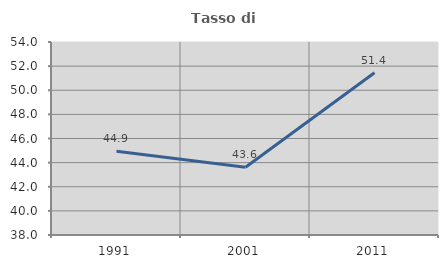
| Category | Tasso di occupazione   |
|---|---|
| 1991.0 | 44.944 |
| 2001.0 | 43.617 |
| 2011.0 | 51.445 |